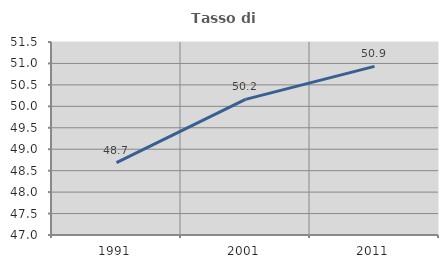
| Category | Tasso di occupazione   |
|---|---|
| 1991.0 | 48.686 |
| 2001.0 | 50.162 |
| 2011.0 | 50.932 |